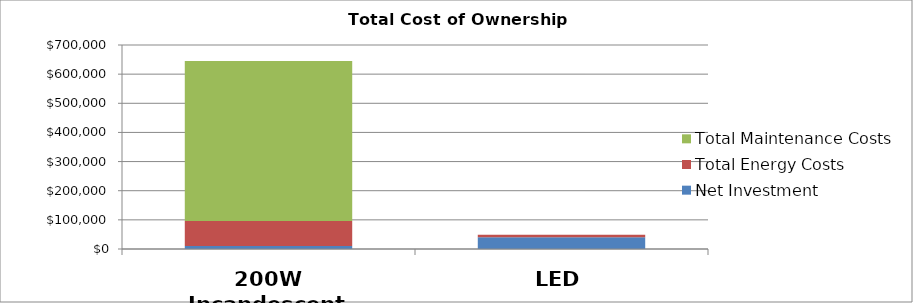
| Category | Net Investment | Total Energy Costs | Total Maintenance Costs |
|---|---|---|---|
| 200W Incandescent | 10000 | 86000 | 549090.909 |
| LED | 40000 | 8800 | 0 |